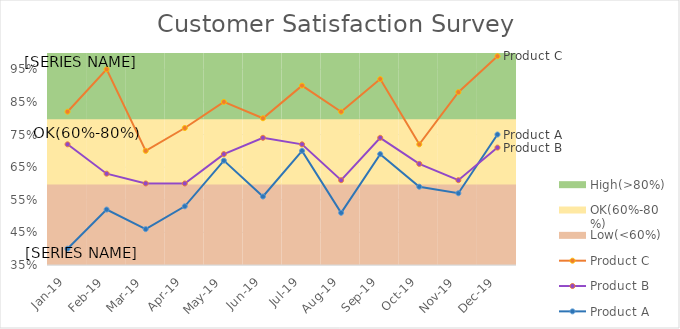
| Category | Low(<60%) | OK(60%-80%) | High(>80%) |
|---|---|---|---|
| Jan-19 | 0.6 | 0.2 | 0.2 |
| Feb-19 | 0.6 | 0.2 | 0.2 |
| Mar-19 | 0.6 | 0.2 | 0.2 |
| Apr-19 | 0.6 | 0.2 | 0.2 |
| May-19 | 0.6 | 0.2 | 0.2 |
| Jun-19 | 0.6 | 0.2 | 0.2 |
| Jul-19 | 0.6 | 0.2 | 0.2 |
| Aug-19 | 0.6 | 0.2 | 0.2 |
| Sep-19 | 0.6 | 0.2 | 0.2 |
| Oct-19 | 0.6 | 0.2 | 0.2 |
| Nov-19 | 0.6 | 0.2 | 0.2 |
| Dec-19 | 0.6 | 0.2 | 0.2 |